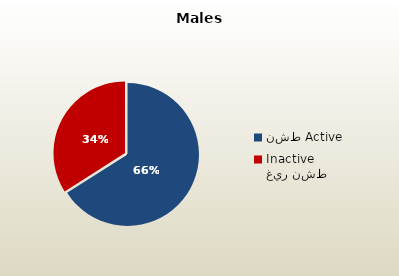
| Category | الذكور القطريين  Qatari Males |
|---|---|
| نشط Active | 73634 |
| غير نشط Inactive | 37934 |